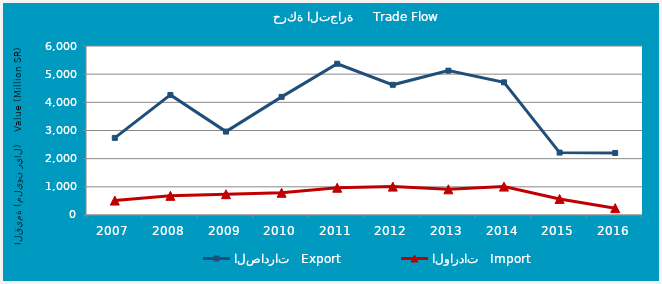
| Category | الصادرات   Export | الواردات   Import |
|---|---|---|
| 2007.0 | 2737.959 | 513.1 |
| 2008.0 | 4263.114 | 680.936 |
| 2009.0 | 2960.881 | 737.982 |
| 2010.0 | 4194.227 | 788.476 |
| 2011.0 | 5369.497 | 968.537 |
| 2012.0 | 4622.217 | 1007.61 |
| 2013.0 | 5125.121 | 912.115 |
| 2014.0 | 4709.558 | 1008.908 |
| 2015.0 | 2216.473 | 569.829 |
| 2016.0 | 2203.212 | 243.144 |